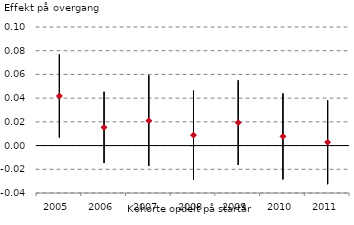
| Category | Serie 1 | Serie 2 | Serie 3 |
|---|---|---|---|
| 2005.0 | 0.077 | 0.007 | 0.042 |
| 2006.0 | 0.045 | -0.015 | 0.015 |
| 2007.0 | 0.059 | -0.017 | 0.021 |
| 2008.0 | 0.046 | -0.029 | 0.009 |
| 2009.0 | 0.055 | -0.016 | 0.019 |
| 2010.0 | 0.044 | -0.029 | 0.008 |
| 2011.0 | 0.038 | -0.033 | 0.003 |